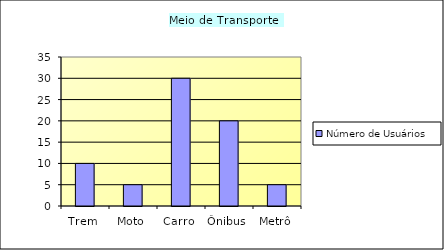
| Category | Número de Usuários |
|---|---|
| Trem | 10 |
| Moto | 5 |
| Carro | 30 |
| Ônibus | 20 |
| Metrô | 5 |